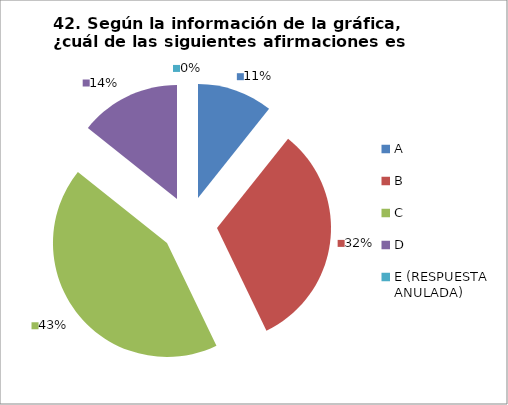
| Category | CANTIDAD DE RESPUESTAS PREGUNTA (42) | PORCENTAJE |
|---|---|---|
| A | 3 | 0.107 |
| B | 9 | 0.321 |
| C | 12 | 0.429 |
| D | 4 | 0.143 |
| E (RESPUESTA ANULADA) | 0 | 0 |